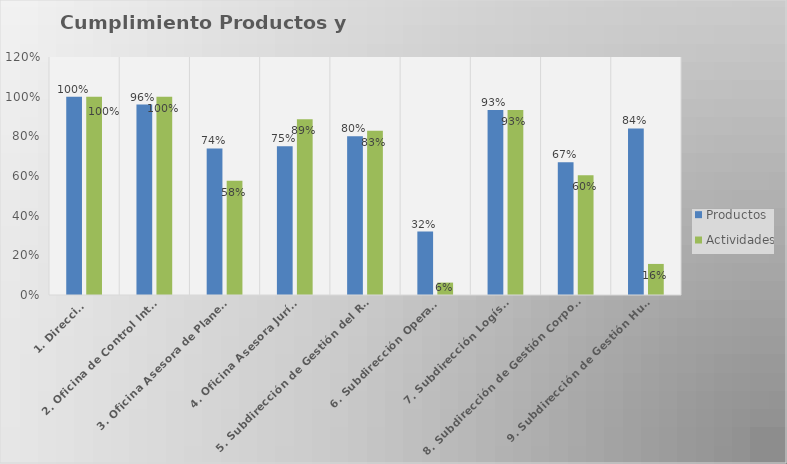
| Category | Productos | Actividades |
|---|---|---|
| 1. Dirección | 1 | 1 |
| 2. Oficina de Control Interno | 0.96 | 1 |
| 3. Oficina Asesora de Planeación | 0.739 | 0.576 |
| 4. Oficina Asesora Jurídica | 0.75 | 0.886 |
| 5. Subdirección de Gestión del Riesgo | 0.8 | 0.828 |
| 6. Subdirección Operativa | 0.32 | 0.062 |
| 7. Subdirección Logística | 0.933 | 0.933 |
| 8. Subdirección de Gestión Corporativa | 0.669 | 0.604 |
| 9. Subdirección de Gestión Humana | 0.84 | 0.157 |